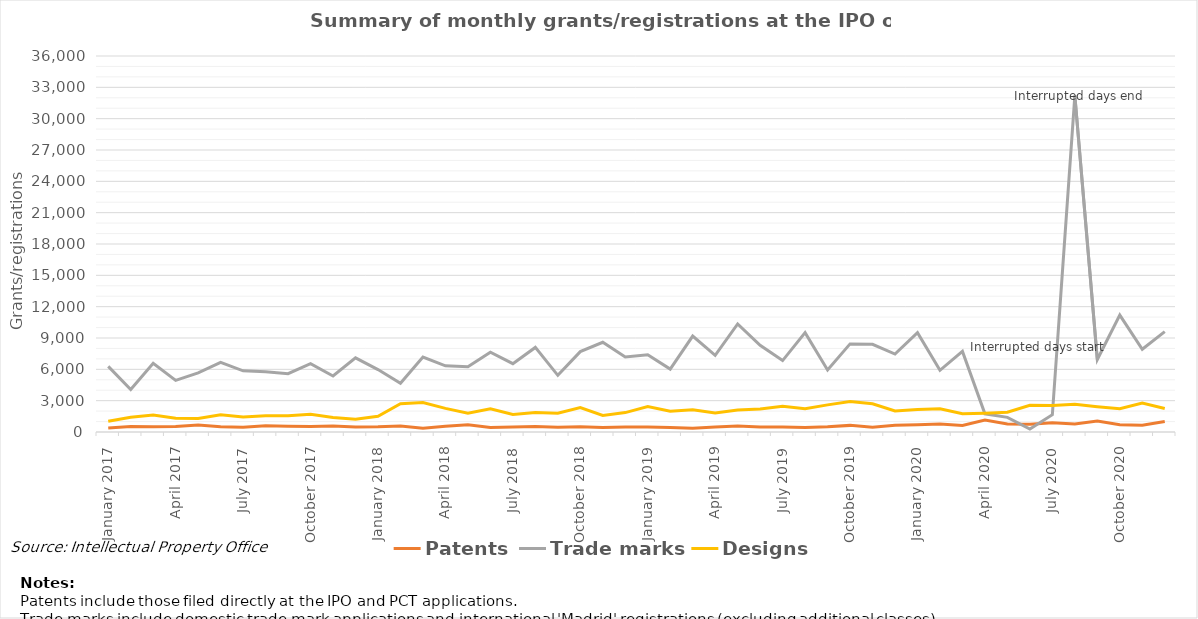
| Category | Patents | Trade marks | Designs |
|---|---|---|---|
| January 2017 | 387 | 6287 | 1026 |
| February 2017 | 533 | 4063 | 1420 |
| March 2017 | 505 | 6576 | 1631 |
| April 2017 | 516 | 4937 | 1318 |
| May 2017 | 681 | 5651 | 1284 |
| June 2017 | 495 | 6658 | 1660 |
| July 2017 | 466 | 5857 | 1437 |
| August 2017 | 592 | 5763 | 1550 |
| September 2017 | 554 | 5578 | 1553 |
| October 2017 | 517 | 6538 | 1705 |
| November 2017 | 578 | 5362 | 1397 |
| December 2017 | 487 | 7101 | 1218 |
| January 2018 | 495 | 5977 | 1512 |
| February 2018 | 574 | 4670 | 2704 |
| March 2018 | 370 | 7176 | 2825 |
| April 2018 | 543 | 6332 | 2259 |
| May 2018 | 690 | 6251 | 1789 |
| June 2018 | 424 | 7636 | 2222 |
| July 2018 | 486 | 6546 | 1678 |
| August 2018 | 536 | 8099 | 1878 |
| September 2018 | 450 | 5426 | 1795 |
| October 2018 | 498 | 7698 | 2348 |
| November 2018 | 432 | 8590 | 1592 |
| December 2018 | 484 | 7188 | 1859 |
| January 2019 | 475 | 7393 | 2444 |
| February 2019 | 426 | 6021 | 1987 |
| March 2019 | 363 | 9184 | 2125 |
| April 2019 | 488 | 7335 | 1810 |
| May 2019 | 573 | 10345 | 2096 |
| June 2019 | 471 | 8302 | 2202 |
| July 2019 | 489 | 6839 | 2464 |
| August 2019 | 420 | 9515 | 2219 |
| September 2019 | 500 | 5942 | 2596 |
| October 2019 | 634 | 8436 | 2926 |
| November 2019 | 455 | 8398 | 2700 |
| December 2019 | 654 | 7464 | 2021 |
| January 2020 | 696 | 9515 | 2145 |
| February 2020 | 756 | 5905 | 2220 |
| March 2020 | 622 | 7719 | 1758 |
| April 2020 | 1143 | 1741 | 1803 |
| May 2020 | 768 | 1399 | 1888 |
| June 2020 | 740 | 280 | 2564 |
| July 2020 | 878 | 1657 | 2539 |
| August 2020 | 771 | 32197 | 2665 |
| September 2020 | 1042 | 6941 | 2425 |
| October 2020 | 697 | 11197 | 2223 |
| November 2020 | 649 | 7925 | 2763 |